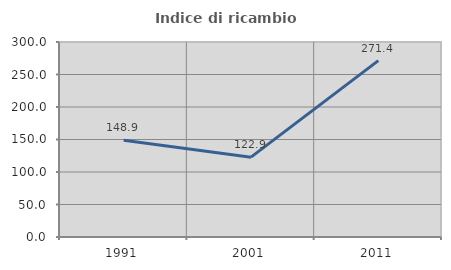
| Category | Indice di ricambio occupazionale  |
|---|---|
| 1991.0 | 148.889 |
| 2001.0 | 122.857 |
| 2011.0 | 271.429 |